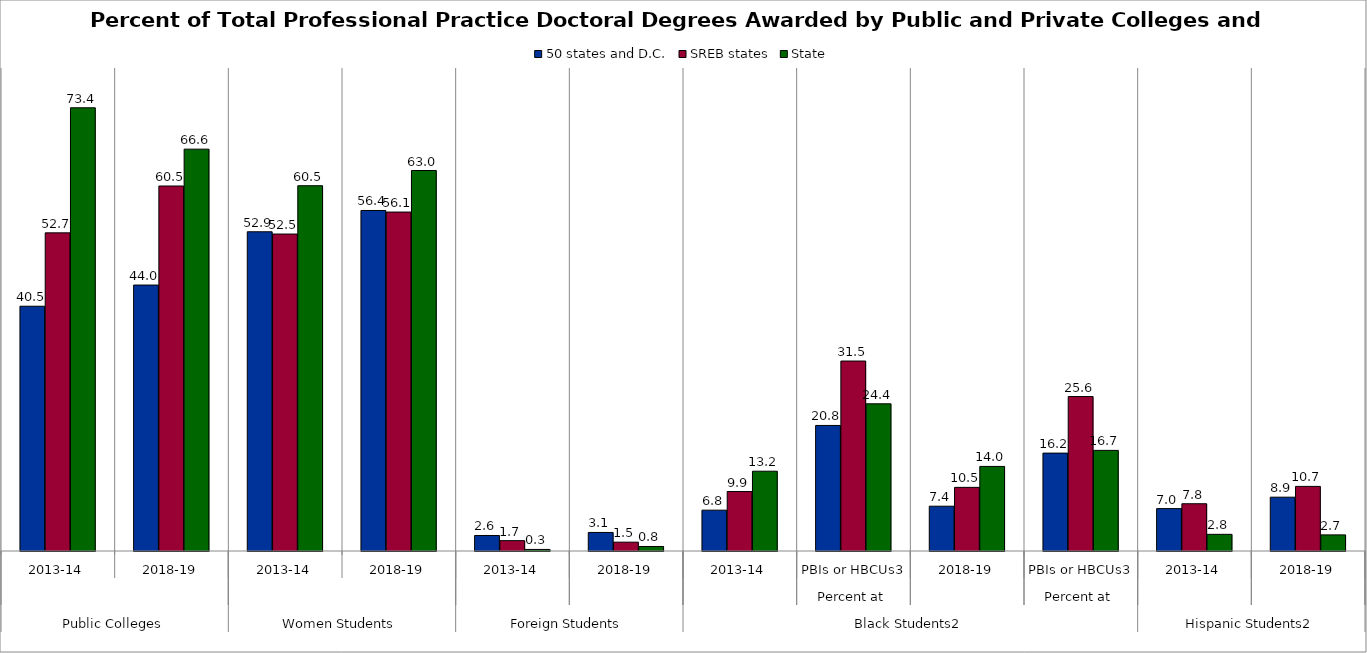
| Category | 50 states and D.C. | SREB states | State |
|---|---|---|---|
| 0 | 40.543 | 52.695 | 73.41 |
| 1 | 44.048 | 60.455 | 66.559 |
| 2 | 52.873 | 52.499 | 60.501 |
| 3 | 56.402 | 56.14 | 63.023 |
| 4 | 2.569 | 1.715 | 0.257 |
| 5 | 3.074 | 1.464 | 0.75 |
| 6 | 6.764 | 9.85 | 13.215 |
| 7 | 20.797 | 31.464 | 24.378 |
| 8 | 7.418 | 10.539 | 14.008 |
| 9 | 16.211 | 25.584 | 16.667 |
| 10 | 7.019 | 7.827 | 2.761 |
| 11 | 8.914 | 10.7 | 2.668 |